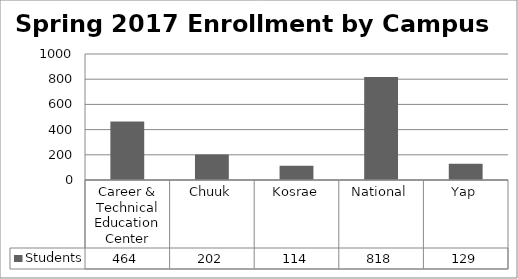
| Category | Students |
|---|---|
| Career & Technical Education Center | 464 |
| Chuuk | 202 |
| Kosrae | 114 |
| National | 818 |
| Yap | 129 |